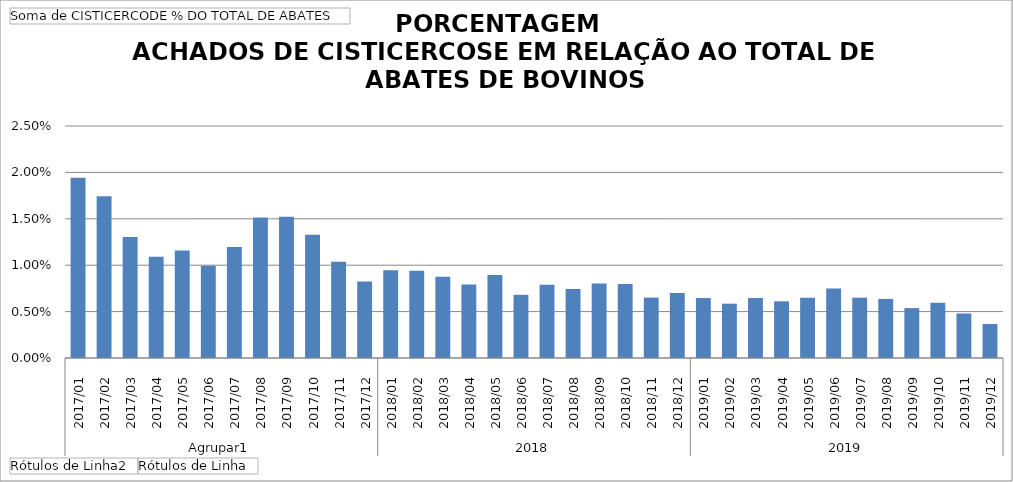
| Category | Total |
|---|---|
| 0 | 0.019 |
| 1 | 0.017 |
| 2 | 0.013 |
| 3 | 0.011 |
| 4 | 0.012 |
| 5 | 0.01 |
| 6 | 0.012 |
| 7 | 0.015 |
| 8 | 0.015 |
| 9 | 0.013 |
| 10 | 0.01 |
| 11 | 0.008 |
| 12 | 0.009 |
| 13 | 0.009 |
| 14 | 0.009 |
| 15 | 0.008 |
| 16 | 0.009 |
| 17 | 0.007 |
| 18 | 0.008 |
| 19 | 0.007 |
| 20 | 0.008 |
| 21 | 0.008 |
| 22 | 0.007 |
| 23 | 0.007 |
| 24 | 0.006 |
| 25 | 0.006 |
| 26 | 0.006 |
| 27 | 0.006 |
| 28 | 0.006 |
| 29 | 0.007 |
| 30 | 0.006 |
| 31 | 0.006 |
| 32 | 0.005 |
| 33 | 0.006 |
| 34 | 0.005 |
| 35 | 0.004 |